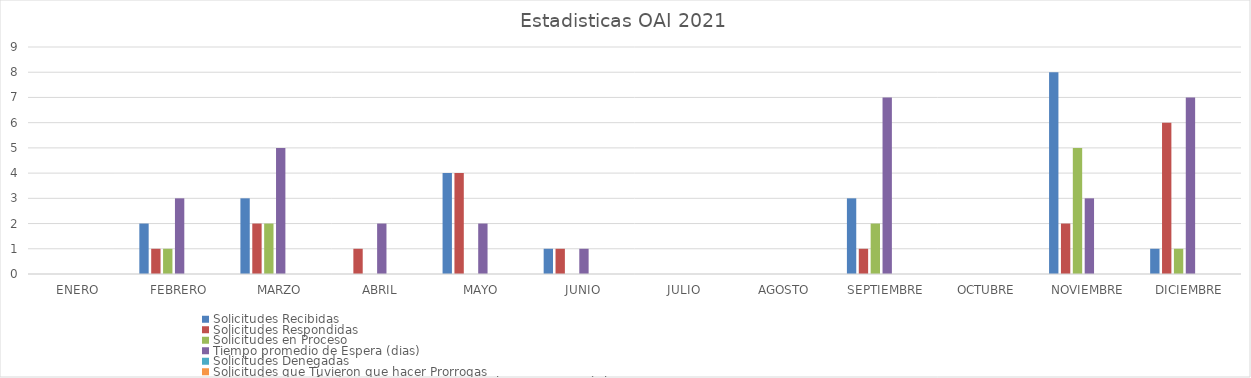
| Category | Solicitudes Recibidas | Solicitudes Respondidas | Solicitudes en Proceso | Tiempo promedio de Espera (dias) | Solicitudes Denegadas | Solicitudes que Tuvieron que hacer Prorrogas  | Solicitudes Transferidas a otras Instituciones a la que Pertenecía la misma |
|---|---|---|---|---|---|---|---|
| ENERO | 0 | 0 | 0 | 0 | 0 | 0 | 0 |
| FEBRERO | 2 | 1 | 1 | 3 | 0 | 0 | 0 |
| MARZO | 3 | 2 | 2 | 5 | 0 | 0 | 0 |
| ABRIL | 0 | 1 | 0 | 2 | 0 | 0 | 0 |
| MAYO | 4 | 4 | 0 | 2 | 0 | 0 | 0 |
| JUNIO | 1 | 1 | 0 | 1 | 0 | 0 | 0 |
| JULIO | 0 | 0 | 0 | 0 | 0 | 0 | 0 |
| AGOSTO | 0 | 0 | 0 | 0 | 0 | 0 | 0 |
| SEPTIEMBRE | 3 | 1 | 2 | 7 | 0 | 0 | 0 |
| OCTUBRE | 0 | 0 | 0 | 0 | 0 | 0 | 0 |
| NOVIEMBRE | 8 | 2 | 5 | 3 | 0 | 0 | 0 |
| DICIEMBRE | 1 | 6 | 1 | 7 | 0 | 0 | 0 |